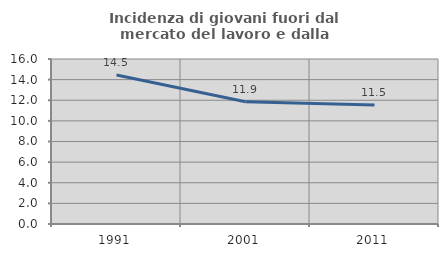
| Category | Incidenza di giovani fuori dal mercato del lavoro e dalla formazione  |
|---|---|
| 1991.0 | 14.451 |
| 2001.0 | 11.85 |
| 2011.0 | 11.547 |